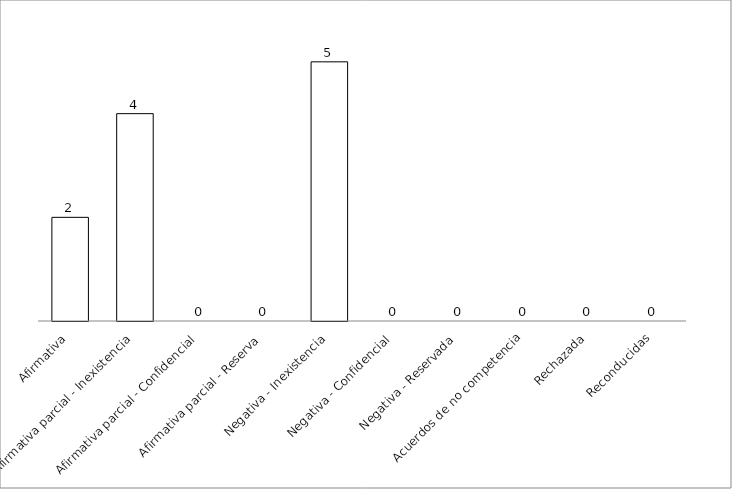
| Category | Series 0 |
|---|---|
| Afirmativa | 2 |
| Afirmativa parcial - Inexistencia | 4 |
| Afirmativa parcial - Confidencial | 0 |
| Afirmativa parcial - Reserva | 0 |
| Negativa - Inexistencia | 5 |
| Negativa - Confidencial | 0 |
| Negativa - Reservada | 0 |
| Acuerdos de no competencia | 0 |
| Rechazada | 0 |
| Reconducidas | 0 |